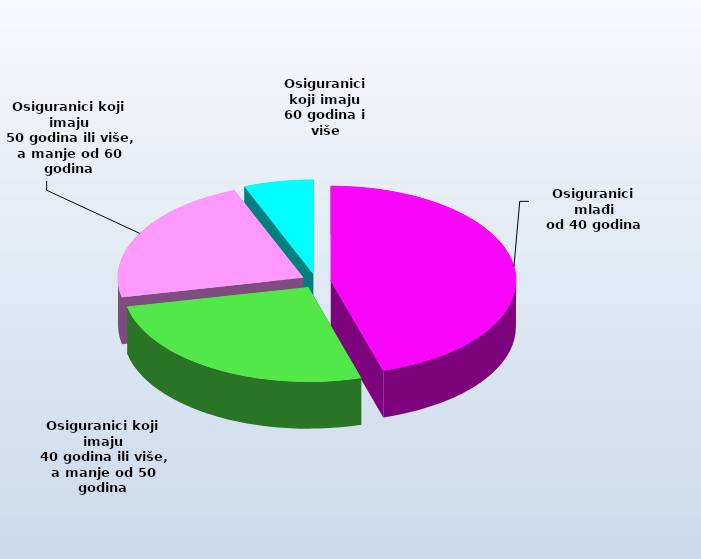
| Category | Series 0 |
|---|---|
| Osiguranici mlađi
od 40 godina | 724573 |
| Osiguranici koji imaju
 40 godina ili više, a manje od 50 godina | 419153 |
| Osiguranici koji imaju
 50 godina ili više, a manje od 60 godina | 354907 |
| Osiguranici koji imaju
60 godina i više | 96813 |